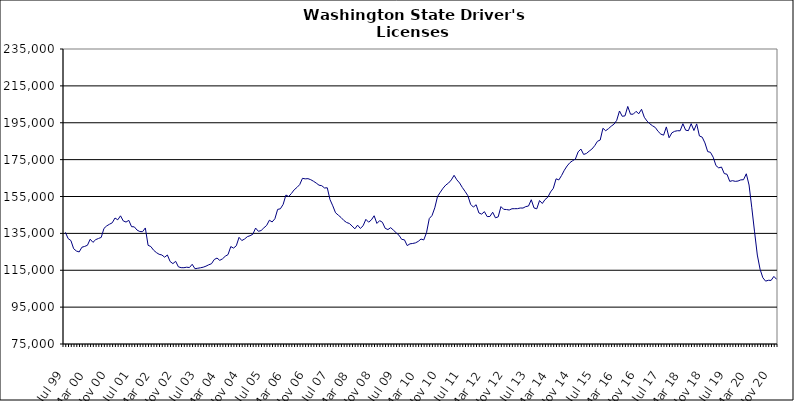
| Category | Series 0 |
|---|---|
| Jul 99 | 135560 |
| Aug 99 | 132182 |
| Sep 99 | 131104 |
| Oct 99 | 126694 |
| Nov 99 | 125425 |
| Dec 99 | 124927 |
| Jan 00 | 127499 |
| Feb 00 | 127927 |
| Mar 00 | 128547 |
| Apr 00 | 131834 |
| May 00 | 130120 |
| Jun 00 | 131595 |
| Jul 00 | 132236 |
| Aug 00 | 132819 |
| Sep 00 | 137711 |
| Oct 00 | 139063 |
| Nov 00 | 139952 |
| Dec 00 | 140732 |
| Jan 01 | 143338 |
| Feb 01 | 142359 |
| Mar 01 | 144523 |
| Apr 01 | 141758 |
| May 01 | 141135 |
| Jun 01 | 142064 |
| Jul 01 | 138646 |
| Aug 01 | 138530 |
| Sep 01 | 136784 |
| Oct 01 | 135996 |
| Nov 01 | 135917 |
| Dec 01 | 137940 |
| Jan 02 | 128531 |
| Feb 02 | 127848 |
| Mar 02 | 125876 |
| Apr 02 | 124595 |
| May 02 | 123660 |
| Jun 02 | 123282 |
| Jul 02 | 122089 |
| Aug 02 | 123279 |
| Sep 02 | 119727 |
| Oct 02 | 118588 |
| Nov 02 | 119854 |
| Dec 02 | 116851 |
| Jan 03 | 116407 |
| Feb 03 | 116382 |
| Mar 03 | 116648 |
| Apr 03 | 116471 |
| May 03 | 118231 |
| Jun 03 | 115831 |
| Jul 03 | 116082 |
| Aug 03 | 116341 |
| Sep 03 | 116653 |
| Oct 03 | 117212 |
| Nov 03 | 117962 |
| Dec 03 | 118542 |
| Jan 04 | 120817 |
| Feb 04 | 121617 |
| Mar 04 | 120369 |
| Apr 04 | 121200 |
| May 04 | 122609 |
| Jun 04 | 123484 |
| Jul 04 | 127844 |
| Aug 04 | 127025 |
| Sep 04 | 128273 |
| Oct 04 | 132853 |
| Nov 04 | 131106 |
| Dec 04 | 131935 |
| Jan 05 | 133205 |
| Feb 05 | 133736 |
| Mar 05 | 134528 |
| Apr 05 | 137889 |
| May 05 | 136130 |
| Jun 05 | 136523 |
| Jul 05 | 137997 |
| Aug 05 | 139294 |
| Sep 05 | 142140 |
| Oct 05 | 141192 |
| Nov 05 | 142937 |
| Dec 05 | 148013 |
| Jan 06 | 148341 |
| Feb 06 | 150744 |
| Mar 06 | 155794 |
| Apr 06 | 154984 |
| May 06 | 156651 |
| Jun 06 | 158638 |
| Jul 06 | 159911 |
| Aug 06 | 161445 |
| Sep 06 | 164852 |
| Oct 06 | 164570 |
| Nov 06 | 164679 |
| Dec 06 | 164127 |
| Jan 07 | 163271 |
| Feb 07 | 162273 |
| Mar 07 | 161140 |
| Apr 07 | 160860 |
| May 07 | 159633 |
| Jun 07 | 159724 |
| Jul 07 | 153303 |
| Aug 07 | 149939 |
| Sep 07 | 146172 |
| Oct 07 | 144876 |
| Nov 07 | 143613 |
| Dec 07 | 142022 |
| Jan 08 | 140909 |
| Feb 08 | 140368 |
| Mar 08 | 138998 |
| Apr 08 | 137471 |
| May 08 | 139453 |
| Jun 08 | 137680 |
| Jul 08 | 139120 |
| Aug 08 | 142612 |
| Sep-08 | 141071 |
| Oct 08 | 142313 |
| Nov 08 | 144556 |
| Dec 08 | 140394 |
| Jan 09 | 141903 |
| Feb 09 | 141036 |
| Mar 09 | 137751 |
| Apr 09 | 137060 |
| May 09 | 138101 |
| Jun 09 | 136739 |
| Jul 09 | 135317 |
| Aug 09 | 134020 |
| Sep 09 | 131756 |
| Oct 09 | 131488 |
| Nov 09 | 128370 |
| Dec 09 | 129323 |
| Jan 10 | 129531 |
| Feb 10 | 129848 |
| Mar 10 | 130654 |
| Apr 10 | 131929 |
| May 10 | 131429 |
| Jun 10 | 135357 |
| Jul 10 | 143032 |
| Aug 10 | 144686 |
| Sep 10 | 148856 |
| Oct 10 | 155042 |
| Nov 10 | 157328 |
| Dec 10 | 159501 |
| Jan 11 | 161221 |
| Feb 11 | 162312 |
| Mar 11 | 163996 |
| Apr 11 | 166495 |
| May 11 | 164040 |
| Jun 11 | 162324 |
| Jul 11 | 159862 |
| Aug 11 | 157738 |
| Sep 11 | 155430 |
| Oct 11 | 150762 |
| Nov 11 | 149255 |
| Dec 11 | 150533 |
| Jan 12 | 146068 |
| Feb 12 | 145446 |
| Mar 12 | 146788 |
| Apr 12 | 144110 |
| May 12 | 144162 |
| Jun 12 | 146482 |
| Jul 12 | 143445 |
| Aug 12 | 143950 |
| Sep 12 | 149520 |
| Oct 12 | 148033 |
| Nov 12 | 147926 |
| Dec 12 | 147674 |
| Jan 13 | 148360 |
| Feb-13 | 148388 |
| Mar-13 | 148414 |
| Apr 13 | 148749 |
| May 13 | 148735 |
| Jun-13 | 149521 |
| Jul 13 | 149837 |
| Aug 13 | 153252 |
| Sep 13 | 148803 |
| Oct 13 | 148315 |
| Nov 13 | 152804 |
| Dec 13 | 151209 |
| Jan 14 | 153357 |
| Feb-14 | 154608 |
| Mar 14 | 157479 |
| Apr 14 | 159441 |
| May 14 | 164591 |
| Jun 14 | 163995 |
| Jul-14 | 166411 |
| Aug-14 | 169272 |
| Sep 14 | 171565 |
| Oct 14 | 173335 |
| Nov 14 | 174406 |
| Dec 14 | 175302 |
| Jan 15 | 179204 |
| Feb 15 | 180737 |
| Mar 15 | 177810 |
| Apr-15 | 178331 |
| May 15 | 179601 |
| Jun-15 | 180729 |
| Jul 15 | 182540 |
| Aug 15 | 184924 |
| Sep 15 | 185620 |
| Oct 15 | 192002 |
| Nov 15 | 190681 |
| Dec 15 | 191795 |
| Jan 16 | 193132 |
| Feb 16 | 194206 |
| Mar 16 | 196319 |
| Apr 16 | 201373 |
| May 16 | 198500 |
| Jun 16 | 198743 |
| Jul 16 | 203841 |
| Aug 16 | 199630 |
| Sep 16 | 199655 |
| Oct 16 | 201181 |
| Nov 16 | 199888 |
| Dec 16 | 202304 |
| Jan 17 | 197977 |
| Feb 17 | 195889 |
| Mar 17 | 194438 |
| Apr 17 | 193335 |
| May 17 | 192430 |
| Jun 17 | 190298 |
| Jul 17 | 188832 |
| Aug 17 | 188264 |
| Sep 17 | 192738 |
| Oct 17 | 186856 |
| Nov 17 | 189537 |
| Dec 17 | 190341 |
| Jan 18 | 190670 |
| Feb 18 | 190645 |
| Mar 18 | 194476 |
| Apr 18 | 190971 |
| May 18 | 190707 |
| Jun 18 | 194516 |
| Jul 18 | 190783 |
| Aug 18 | 194390 |
| Sep 18 | 187831 |
| Oct 18 | 187188 |
| Nov 18 | 184054 |
| Dec 18 | 179347 |
| Jan 19 | 178958 |
| Feb 19 | 176289 |
| Mar 19 | 171747 |
| Apr 19 | 170532 |
| May 19 | 170967 |
| Jun 19 | 167444 |
| Jul 19 | 167059 |
| Aug 19 | 163194 |
| Sep 19 | 163599 |
| Oct 19 | 163212 |
| Nov 19 | 163388 |
| Dec 19 | 164024 |
| Jan 20 | 164114 |
| Feb 20 | 167320 |
| Mar 20 | 161221 |
| Apr 20 | 148866 |
| May 20 | 135821 |
| Jun 20 | 123252 |
| Jul 20 | 115526 |
| Aug 20 | 110940 |
| Sep 20 | 109099 |
| Oct 20 | 109566 |
| Nov 20 | 109488 |
| Dec 20 | 111658 |
| Jan 21 | 110070 |